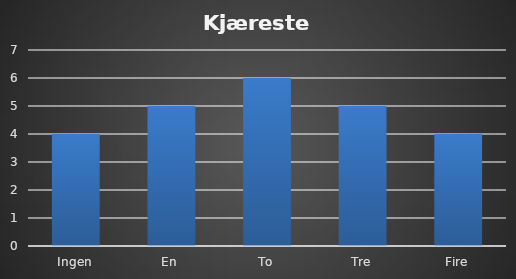
| Category | Series 0 |
|---|---|
| Ingen | 4 |
| En | 5 |
| To | 6 |
| Tre | 5 |
| Fire | 4 |